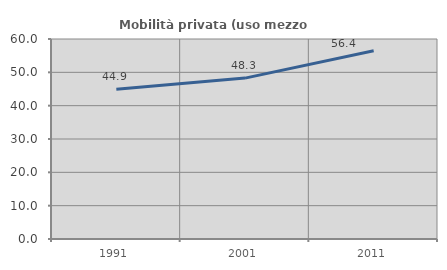
| Category | Mobilità privata (uso mezzo privato) |
|---|---|
| 1991.0 | 44.893 |
| 2001.0 | 48.264 |
| 2011.0 | 56.449 |